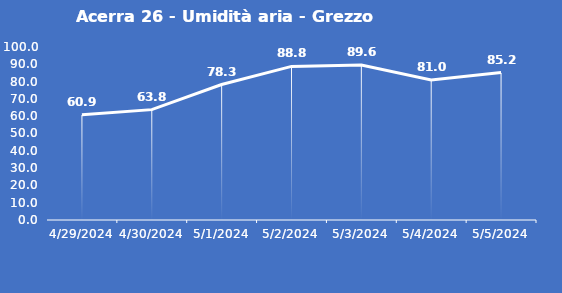
| Category | Acerra 26 - Umidità aria - Grezzo (%) |
|---|---|
| 4/29/24 | 60.9 |
| 4/30/24 | 63.8 |
| 5/1/24 | 78.3 |
| 5/2/24 | 88.8 |
| 5/3/24 | 89.6 |
| 5/4/24 | 81 |
| 5/5/24 | 85.2 |